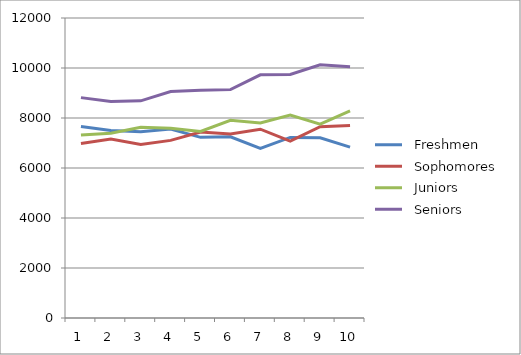
| Category |   Freshmen  |   Sophomores  |   Juniors  |   Seniors  |
|---|---|---|---|---|
| 0 | 7656 | 6983 | 7323 | 8815 |
| 1 | 7496 | 7155 | 7392 | 8660 |
| 2 | 7447 | 6938 | 7626 | 8687 |
| 3 | 7561 | 7104 | 7592 | 9056 |
| 4 | 7227 | 7435 | 7460 | 9113 |
| 5 | 7245 | 7356 | 7911 | 9135 |
| 6 | 6787 | 7553 | 7799 | 9728 |
| 7 | 7222 | 7077 | 8117 | 9744 |
| 8 | 7208 | 7653 | 7757 | 10128 |
| 9 | 6837 | 7701 | 8287 | 10051 |